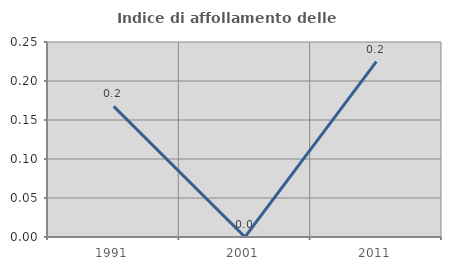
| Category | Indice di affollamento delle abitazioni  |
|---|---|
| 1991.0 | 0.168 |
| 2001.0 | 0 |
| 2011.0 | 0.225 |